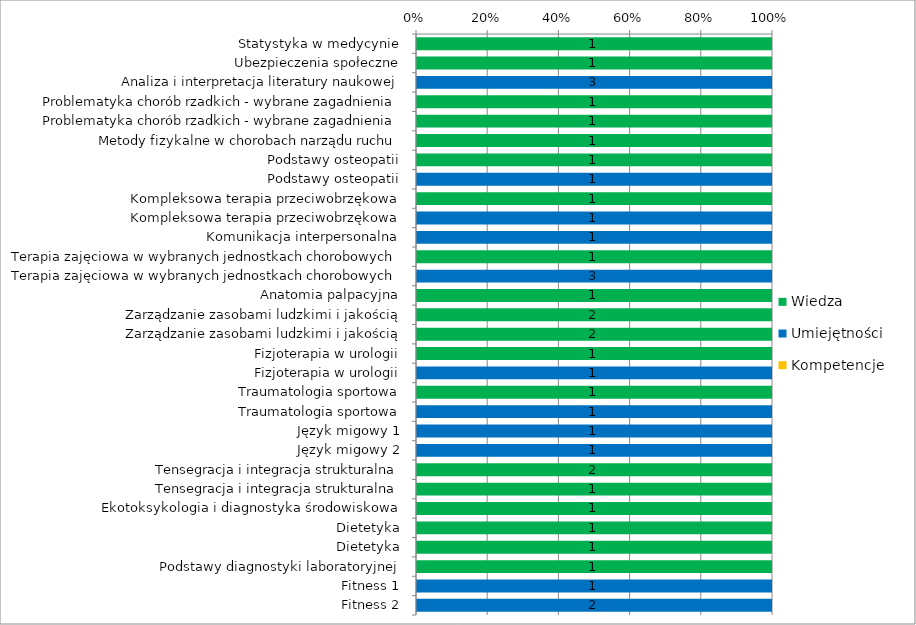
| Category | Wiedza | Umiejętności | Kompetencje |
|---|---|---|---|
| Statystyka w medycynie | 1 | 0 | 0 |
| Ubezpieczenia społeczne | 1 | 0 | 0 |
| Analiza i interpretacja literatury naukowej | 0 | 3 | 0 |
| Problematyka chorób rzadkich - wybrane zagadnienia | 1 | 0 | 0 |
| Problematyka chorób rzadkich - wybrane zagadnienia | 1 | 0 | 0 |
| Metody fizykalne w chorobach narządu ruchu | 1 | 0 | 0 |
| Podstawy osteopatii | 1 | 0 | 0 |
| Podstawy osteopatii | 0 | 1 | 0 |
| Kompleksowa terapia przeciwobrzękowa | 1 | 0 | 0 |
| Kompleksowa terapia przeciwobrzękowa | 0 | 1 | 0 |
| Komunikacja interpersonalna | 0 | 1 | 0 |
| Terapia zajęciowa w wybranych jednostkach chorobowych | 1 | 0 | 0 |
| Terapia zajęciowa w wybranych jednostkach chorobowych | 0 | 3 | 0 |
| Anatomia palpacyjna | 1 | 0 | 0 |
| Zarządzanie zasobami ludzkimi i jakością | 2 | 0 | 0 |
| Zarządzanie zasobami ludzkimi i jakością | 2 | 0 | 0 |
| Fizjoterapia w urologii | 1 | 0 | 0 |
| Fizjoterapia w urologii | 0 | 1 | 0 |
| Traumatologia sportowa | 1 | 0 | 0 |
| Traumatologia sportowa | 0 | 1 | 0 |
| Język migowy 1 | 0 | 1 | 0 |
| Język migowy 2 | 0 | 1 | 0 |
| Tensegracja i integracja strukturalna | 2 | 0 | 0 |
| Tensegracja i integracja strukturalna | 1 | 0 | 0 |
| Ekotoksykologia i diagnostyka środowiskowa | 1 | 0 | 0 |
| Dietetyka | 1 | 0 | 0 |
| Dietetyka | 1 | 0 | 0 |
| Podstawy diagnostyki laboratoryjnej | 1 | 0 | 0 |
| Fitness 1 | 0 | 1 | 0 |
| Fitness 2 | 0 | 2 | 0 |